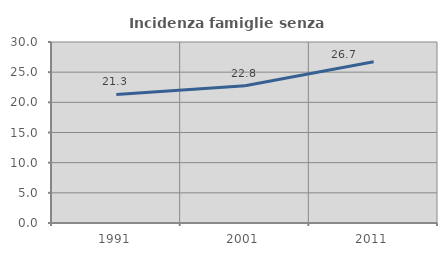
| Category | Incidenza famiglie senza nuclei |
|---|---|
| 1991.0 | 21.31 |
| 2001.0 | 22.757 |
| 2011.0 | 26.712 |